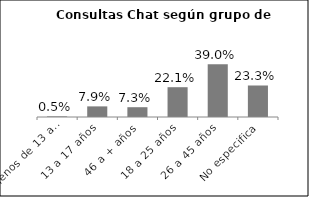
| Category | Series 2 |
|---|---|
| Menos de 13 años | 0.005 |
| 13 a 17 años | 0.079 |
| 46 a + años | 0.073 |
| 18 a 25 años | 0.221 |
| 26 a 45 años | 0.39 |
| No especifica | 0.233 |